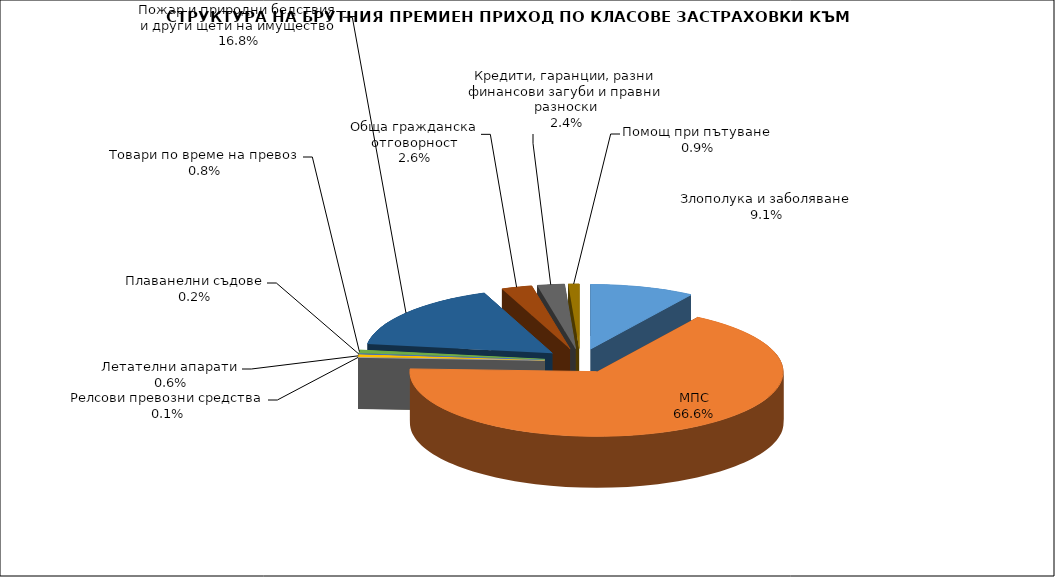
| Category | Злополука и заболяване |
|---|---|
| Злополука и заболяване | 0.091 |
| МПС | 0.666 |
| Релсови превозни средства | 0.001 |
| Летателни апарати | 0.006 |
| Плаванелни съдове | 0.002 |
| Товари по време на превоз | 0.008 |
| Пожар и природни бедствия и други щети на имущество | 0.168 |
| Обща гражданска отговорност | 0.026 |
| Кредити, гаранции, разни финансови загуби и правни разноски | 0.024 |
| Помощ при пътуване | 0.009 |